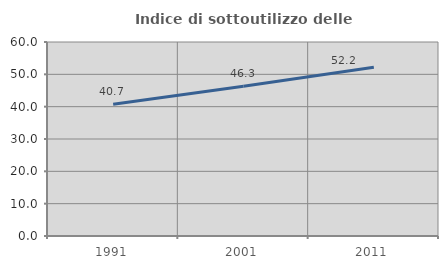
| Category | Indice di sottoutilizzo delle abitazioni  |
|---|---|
| 1991.0 | 40.714 |
| 2001.0 | 46.325 |
| 2011.0 | 52.165 |